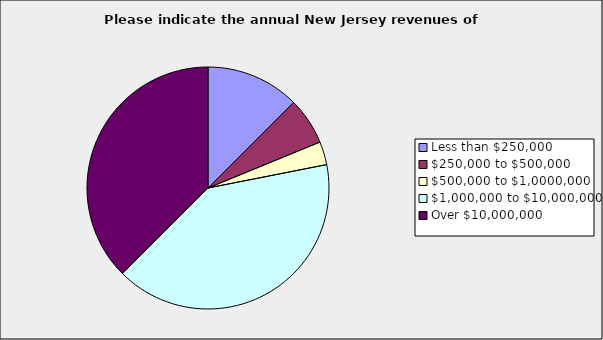
| Category | Series 0 |
|---|---|
| Less than $250,000 | 0.125 |
| $250,000 to $500,000 | 0.063 |
| $500,000 to $1,0000,000 | 0.031 |
| $1,000,000 to $10,000,000 | 0.406 |
| Over $10,000,000 | 0.375 |